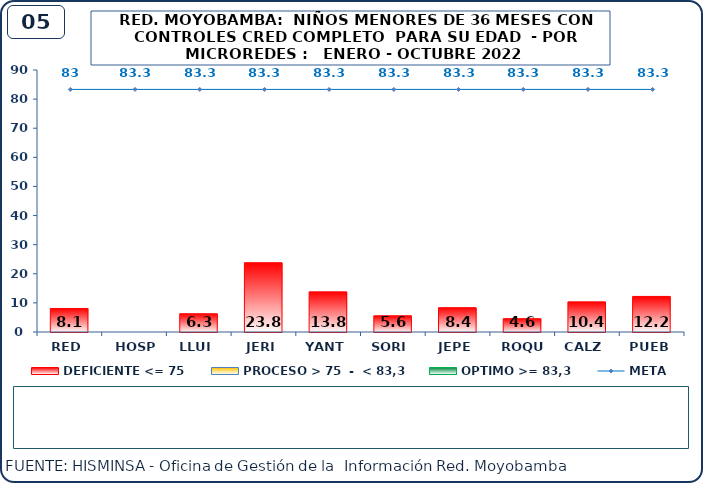
| Category | DEFICIENTE <= 75 | PROCESO > 75  -  < 83,3 | OPTIMO >= 83,3 |
|---|---|---|---|
| RED | 8.08 | 0 | 0 |
| HOSP | 0 | 0 | 0 |
| LLUI | 6.29 | 0 | 0 |
| JERI | 23.81 | 0 | 0 |
| YANT | 13.81 | 0 | 0 |
| SORI | 5.59 | 0 | 0 |
| JEPE | 8.37 | 0 | 0 |
| ROQU | 4.59 | 0 | 0 |
| CALZ | 10.37 | 0 | 0 |
| PUEB | 12.22 | 0 | 0 |